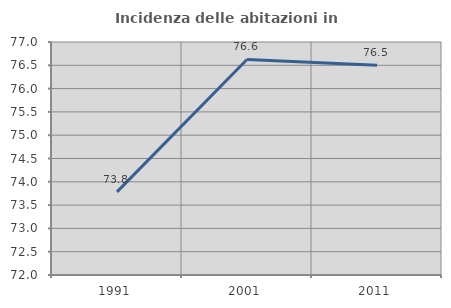
| Category | Incidenza delle abitazioni in proprietà  |
|---|---|
| 1991.0 | 73.784 |
| 2001.0 | 76.625 |
| 2011.0 | 76.502 |